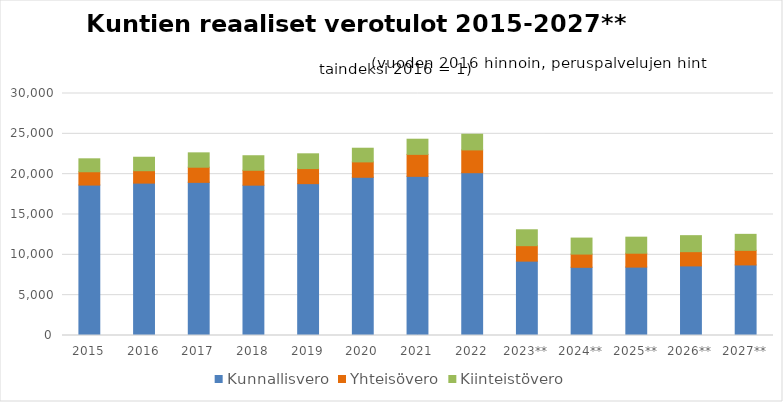
| Category | Kunnallisvero | Yhteisövero | Kiinteistövero |
|---|---|---|---|
| 2015 | 18646.898 | 1652.438 | 1604.013 |
| 2016 | 18890.563 | 1537.872 | 1669.703 |
| 2017 | 18984.903 | 1876.821 | 1781.79 |
| 2018 | 18637.434 | 1845.137 | 1801.77 |
| 2019 | 18825.284 | 1868.046 | 1830.346 |
| 2020 | 19613.622 | 1907.626 | 1694.608 |
| 2021 | 19729.802 | 2724.595 | 1879.564 |
| 2022 | 20180.604 | 2827.179 | 1944.423 |
| 2023** | 9217.865 | 1917.029 | 1970.778 |
| 2024** | 8452.118 | 1641.273 | 1983.571 |
| 2025** | 8479.391 | 1721.704 | 1988.568 |
| 2026** | 8626.934 | 1765.747 | 1984.363 |
| 2027** | 8748.641 | 1808.93 | 1981.6 |